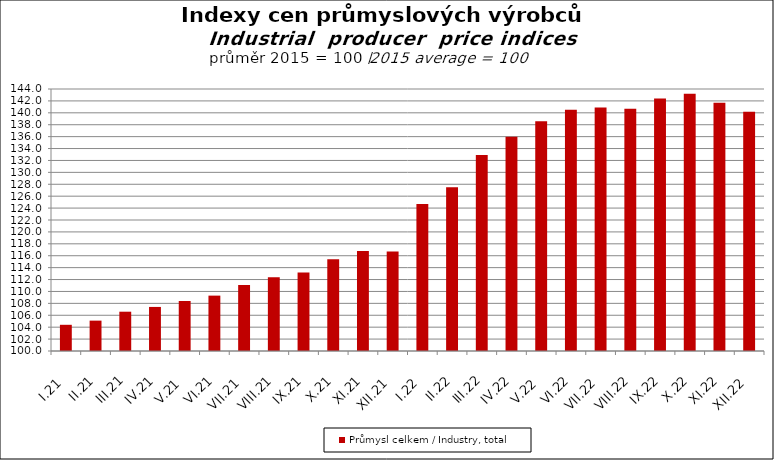
| Category | Průmysl celkem / Industry, total |
|---|---|
| I.21 | 104.4 |
| II.21 | 105.1 |
| III.21 | 106.6 |
| IV.21 | 107.4 |
| V.21 | 108.4 |
| VI.21 | 109.3 |
| VII.21 | 111.1 |
| VIII.21 | 112.4 |
| IX.21 | 113.2 |
| X.21 | 115.4 |
| XI.21 | 116.8 |
| XII.21 | 116.7 |
| I.22 | 124.7 |
| II.22 | 127.5 |
| III.22 | 132.9 |
| IV.22 | 136 |
| V.22 | 138.6 |
| VI.22 | 140.5 |
| VII.22 | 140.9 |
| VIII.22 | 140.7 |
| IX.22 | 142.4 |
| X.22 | 143.2 |
| XI.22 | 141.7 |
| XII.22 | 140.2 |